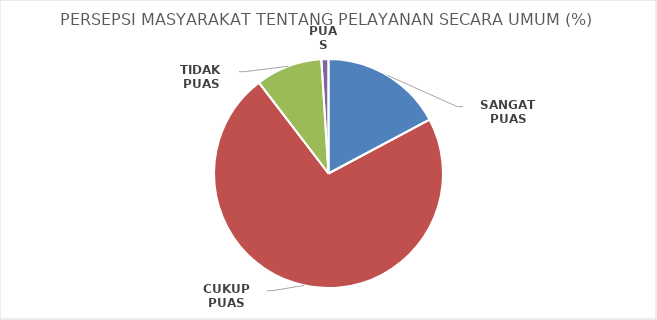
| Category | PERSEPSI LAYANAN SCR UMUM |
|---|---|
| SANGAT PUAS | 17.2 |
| CUKUP PUAS | 72.4 |
| TIDAK PUAS | 9.4 |
| PUAS | 1 |